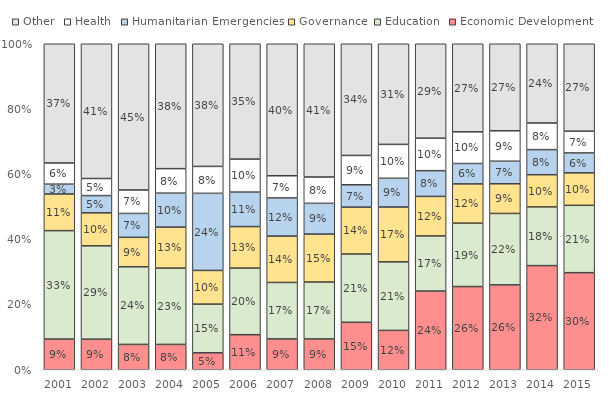
| Category | Economic Development | Education | Governance | Humanitarian Emergencies | Health | Other |
|---|---|---|---|---|---|---|
| 2001.0 | 0.094 | 0.333 | 0.112 | 0.03 | 0.065 | 0.366 |
| 2002.0 | 0.094 | 0.286 | 0.101 | 0.053 | 0.052 | 0.413 |
| 2003.0 | 0.078 | 0.238 | 0.09 | 0.073 | 0.072 | 0.449 |
| 2004.0 | 0.078 | 0.234 | 0.126 | 0.104 | 0.075 | 0.383 |
| 2005.0 | 0.052 | 0.149 | 0.103 | 0.237 | 0.083 | 0.376 |
| 2006.0 | 0.108 | 0.204 | 0.127 | 0.106 | 0.101 | 0.354 |
| 2007.0 | 0.095 | 0.173 | 0.142 | 0.117 | 0.068 | 0.405 |
| 2008.0 | 0.095 | 0.175 | 0.147 | 0.094 | 0.081 | 0.409 |
| 2009.0 | 0.146 | 0.21 | 0.144 | 0.069 | 0.09 | 0.343 |
| 2010.0 | 0.121 | 0.21 | 0.168 | 0.088 | 0.104 | 0.309 |
| 2011.0 | 0.241 | 0.169 | 0.121 | 0.079 | 0.1 | 0.29 |
| 2012.0 | 0.255 | 0.195 | 0.12 | 0.063 | 0.097 | 0.27 |
| 2013.0 | 0.26 | 0.219 | 0.091 | 0.069 | 0.093 | 0.267 |
| 2014.0 | 0.319 | 0.18 | 0.099 | 0.077 | 0.082 | 0.243 |
| 2015.0 | 0.298 | 0.207 | 0.1 | 0.061 | 0.067 | 0.268 |